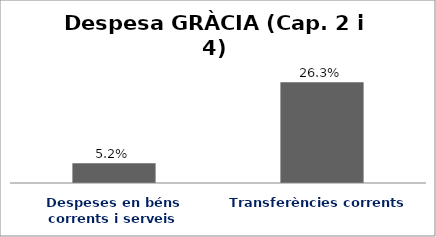
| Category | Series 0 |
|---|---|
| Despeses en béns corrents i serveis | 0.052 |
| Transferències corrents | 0.263 |